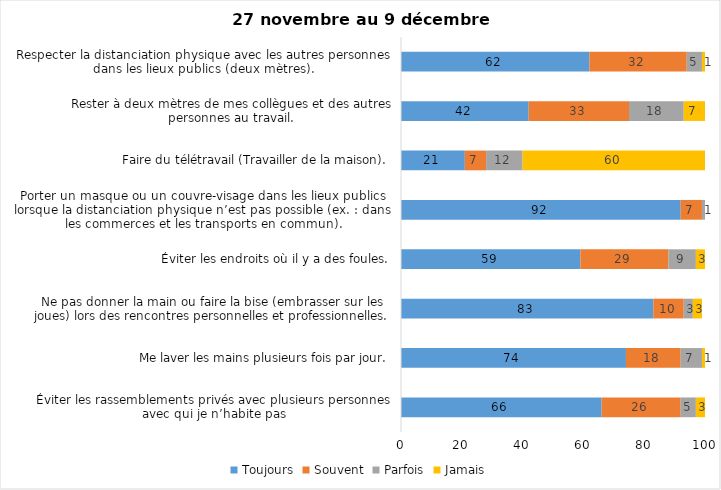
| Category | Toujours | Souvent | Parfois | Jamais |
|---|---|---|---|---|
| Éviter les rassemblements privés avec plusieurs personnes avec qui je n’habite pas | 66 | 26 | 5 | 3 |
| Me laver les mains plusieurs fois par jour. | 74 | 18 | 7 | 1 |
| Ne pas donner la main ou faire la bise (embrasser sur les joues) lors des rencontres personnelles et professionnelles. | 83 | 10 | 3 | 3 |
| Éviter les endroits où il y a des foules. | 59 | 29 | 9 | 3 |
| Porter un masque ou un couvre-visage dans les lieux publics lorsque la distanciation physique n’est pas possible (ex. : dans les commerces et les transports en commun). | 92 | 7 | 1 | 0 |
| Faire du télétravail (Travailler de la maison). | 21 | 7 | 12 | 60 |
| Rester à deux mètres de mes collègues et des autres personnes au travail. | 42 | 33 | 18 | 7 |
| Respecter la distanciation physique avec les autres personnes dans les lieux publics (deux mètres). | 62 | 32 | 5 | 1 |